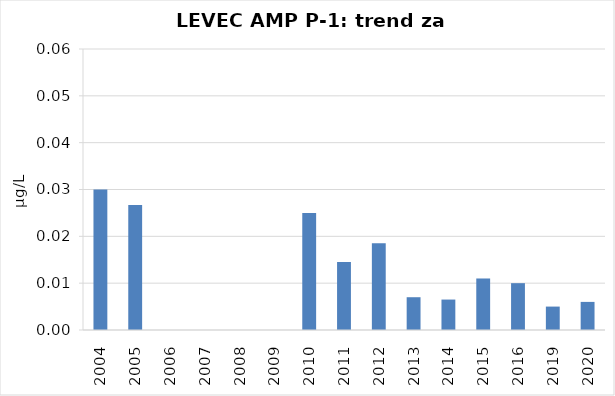
| Category | Vsota |
|---|---|
| 2004 | 0.03 |
| 2005 | 0.027 |
| 2006 | 0 |
| 2007 | 0 |
| 2008 | 0 |
| 2009 | 0 |
| 2010 | 0.025 |
| 2011 | 0.014 |
| 2012 | 0.019 |
| 2013 | 0.007 |
| 2014 | 0.006 |
| 2015 | 0.011 |
| 2016 | 0.01 |
| 2019 | 0.005 |
| 2020 | 0.006 |